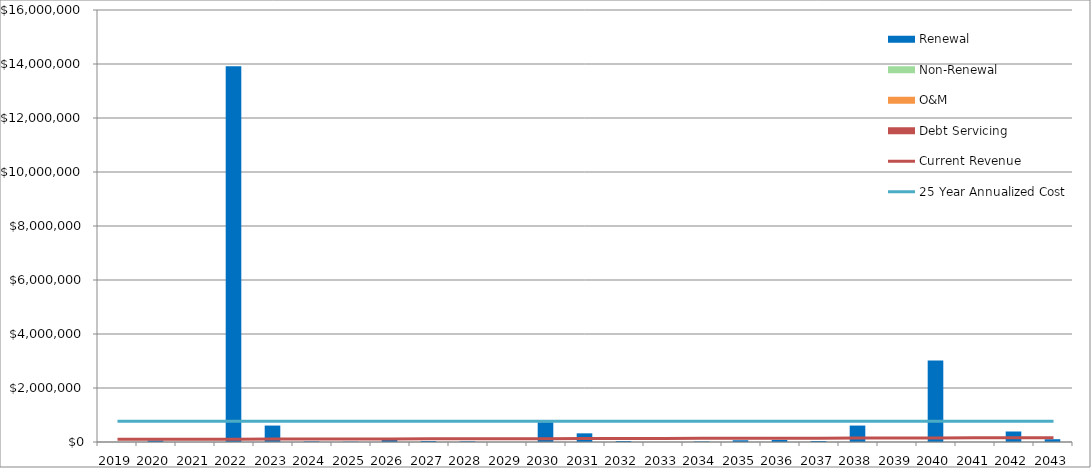
| Category | Debt Servicing | O&M | Non-Renewal | Renewal |
|---|---|---|---|---|
| 2019.0 | 1 | 1 | 1 | 0 |
| 2020.0 | 1 | 1 | 1 | 58040.316 |
| 2021.0 | 1 | 1 | 1 | 0 |
| 2022.0 | 1 | 1 | 1 | 13912356.928 |
| 2023.0 | 1 | 1 | 1 | 608472.972 |
| 2024.0 | 1 | 1 | 1 | 23040.316 |
| 2025.0 | 1 | 1 | 1 | 10839.387 |
| 2026.0 | 1 | 1 | 1 | 100941.029 |
| 2027.0 | 1 | 1 | 1 | 36816.611 |
| 2028.0 | 1 | 1 | 1 | 23040.316 |
| 2029.0 | 1 | 1 | 1 | 0 |
| 2030.0 | 1 | 1 | 1 | 733040.316 |
| 2031.0 | 1 | 1 | 1 | 321038.98 |
| 2032.0 | 1 | 1 | 1 | 36816.611 |
| 2033.0 | 1 | 1 | 1 | 0 |
| 2034.0 | 1 | 1 | 1 | 18525 |
| 2035.0 | 1 | 1 | 1 | 64594.557 |
| 2036.0 | 1 | 1 | 1 | 77900.713 |
| 2037.0 | 1 | 1 | 1 | 36816.611 |
| 2038.0 | 1 | 1 | 1 | 608472.972 |
| 2039.0 | 1 | 1 | 1 | 0 |
| 2040.0 | 1 | 1 | 1 | 3023039.038 |
| 2041.0 | 1 | 1 | 1 | 0 |
| 2042.0 | 1 | 1 | 1 | 389316.611 |
| 2043.0 | 1 | 1 | 1 | 102977.674 |